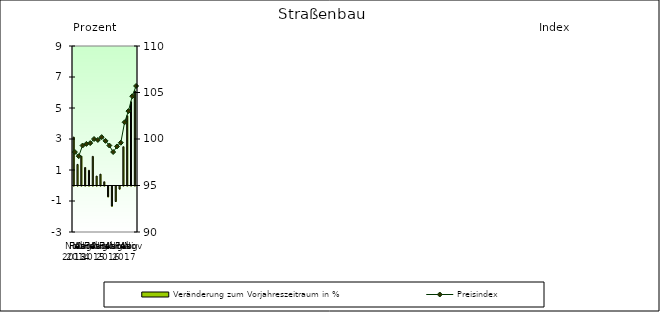
| Category | Veränderung zum Vorjahreszeitraum in % |
|---|---|
| 0 | 3.122 |
| 1 | 1.36 |
| 2 | 1.892 |
| 3 | 1.161 |
| 4 | 0.98 |
| 5 | 1.878 |
| 6 | 0.607 |
| 7 | 0.731 |
| 8 | 0.24 |
| 9 | -0.7 |
| 10 | -1.3 |
| 11 | -1 |
| 12 | -0.2 |
| 13 | 2.5 |
| 14 | 4.5 |
| 15 | 5.4 |
| 16 | 6.1 |